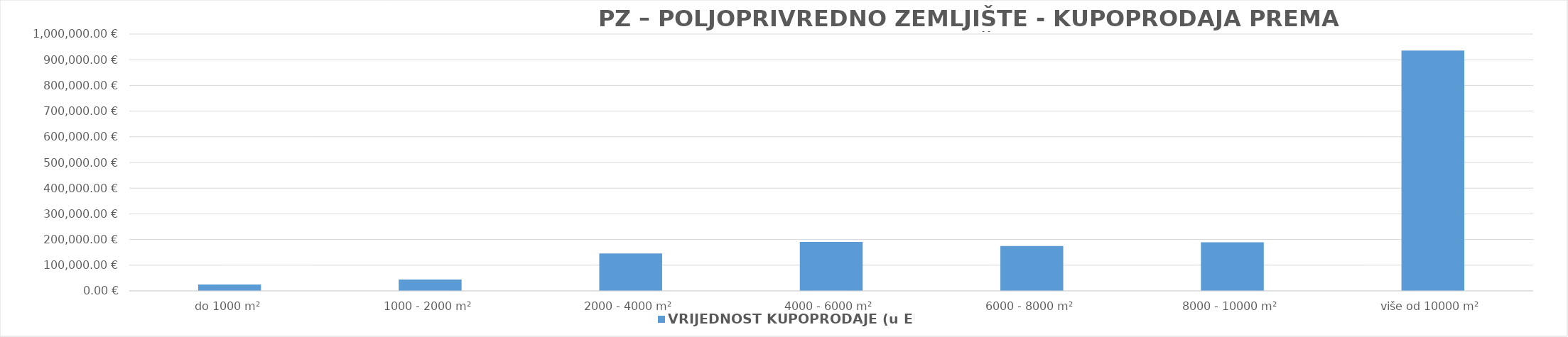
| Category | VRIJEDNOST KUPOPRODAJE (u EUR) |
|---|---|
| do 1000 m² | 25062 |
| 1000 - 2000 m² | 44175.814 |
| 2000 - 4000 m² | 145533.639 |
| 4000 - 6000 m² | 190849.745 |
| 6000 - 8000 m² | 174735.862 |
| 8000 - 10000 m² | 189101.5 |
| više od 10000 m² | 935578.263 |